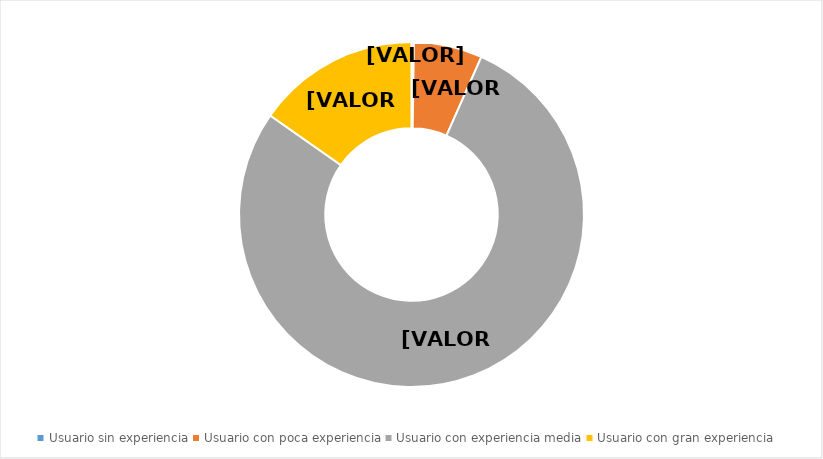
| Category | Series 0 |
|---|---|
| Usuario sin experiencia | 0.002 |
| Usuario con poca experiencia | 0.064 |
| Usuario con experiencia media | 0.781 |
| Usuario con gran experiencia | 0.153 |